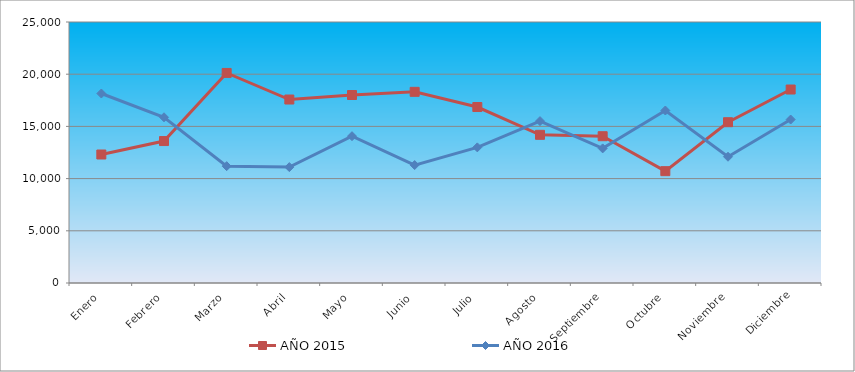
| Category | AÑO 2015 | AÑO 2016 |
|---|---|---|
| Enero | 12308.201 | 18150.166 |
| Febrero | 13596.09 | 15874.903 |
| Marzo | 20121.477 | 11191.976 |
| Abril | 17573.869 | 11101.113 |
| Mayo | 18006.412 | 14062.922 |
| Junio | 18310.743 | 11295.336 |
| Julio | 16855.829 | 12992.229 |
| Agosto | 14193.319 | 15508.182 |
| Septiembre | 14060 | 12892.751 |
| Octubre | 10711.703 | 16522.838 |
| Noviembre | 15401.738 | 12093.442 |
| Diciembre | 18532.635 | 15658.269 |